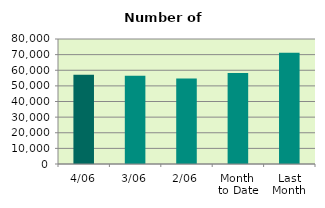
| Category | Series 0 |
|---|---|
| 4/06 | 57128 |
| 3/06 | 56480 |
| 2/06 | 54728 |
| Month 
to Date | 58267 |
| Last
Month | 71249.7 |